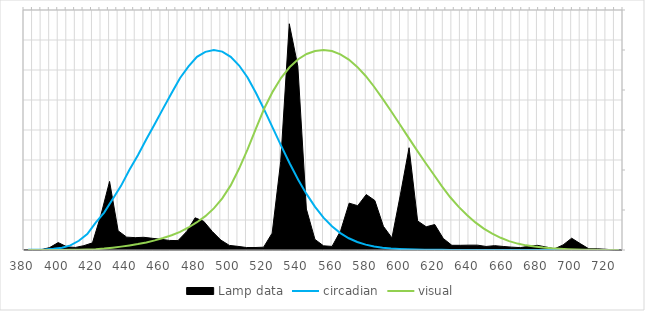
| Category | circadian | visual |
|---|---|---|
| 380.0 | 0.001 | 0 |
| 385.0 | 0.002 | 0 |
| 390.0 | 0.003 | 0 |
| 395.0 | 0.006 | 0 |
| 400.0 | 0.011 | 0 |
| 405.0 | 0.023 | 0.001 |
| 410.0 | 0.046 | 0.001 |
| 415.0 | 0.079 | 0.002 |
| 420.0 | 0.137 | 0.004 |
| 425.0 | 0.187 | 0.007 |
| 430.0 | 0.254 | 0.012 |
| 435.0 | 0.321 | 0.017 |
| 440.0 | 0.402 | 0.023 |
| 445.0 | 0.474 | 0.03 |
| 450.0 | 0.554 | 0.038 |
| 455.0 | 0.63 | 0.048 |
| 460.0 | 0.708 | 0.06 |
| 465.0 | 0.785 | 0.074 |
| 470.0 | 0.86 | 0.091 |
| 475.0 | 0.918 | 0.113 |
| 480.0 | 0.966 | 0.139 |
| 485.0 | 0.991 | 0.169 |
| 490.0 | 1 | 0.208 |
| 495.0 | 0.992 | 0.259 |
| 500.0 | 0.966 | 0.323 |
| 505.0 | 0.922 | 0.407 |
| 510.0 | 0.863 | 0.503 |
| 515.0 | 0.785 | 0.608 |
| 520.0 | 0.7 | 0.71 |
| 525.0 | 0.609 | 0.793 |
| 530.0 | 0.519 | 0.862 |
| 535.0 | 0.433 | 0.915 |
| 540.0 | 0.352 | 0.954 |
| 545.0 | 0.279 | 0.98 |
| 550.0 | 0.216 | 0.995 |
| 555.0 | 0.162 | 1 |
| 560.0 | 0.119 | 0.995 |
| 565.0 | 0.084 | 0.979 |
| 570.0 | 0.059 | 0.952 |
| 575.0 | 0.04 | 0.915 |
| 580.0 | 0.027 | 0.87 |
| 585.0 | 0.018 | 0.816 |
| 590.0 | 0.012 | 0.757 |
| 595.0 | 0.008 | 0.695 |
| 600.0 | 0.005 | 0.631 |
| 605.0 | 0.003 | 0.567 |
| 610.0 | 0.002 | 0.503 |
| 615.0 | 0.001 | 0.441 |
| 620.0 | 0.001 | 0.381 |
| 625.0 | 0.001 | 0.321 |
| 630.0 | 0 | 0.265 |
| 635.0 | 0 | 0.217 |
| 640.0 | 0 | 0.175 |
| 645.0 | 0 | 0.138 |
| 650.0 | 0 | 0.107 |
| 655.0 | 0 | 0.082 |
| 660.0 | 0 | 0.061 |
| 665.0 | 0 | 0.045 |
| 670.0 | 0 | 0.032 |
| 675.0 | 0 | 0.023 |
| 680.0 | 0 | 0.017 |
| 685.0 | 0 | 0.012 |
| 690.0 | 0 | 0.008 |
| 695.0 | 0 | 0.006 |
| 700.0 | 0 | 0.004 |
| 705.0 | 0 | 0.003 |
| 710.0 | 0 | 0.001 |
| 715.0 | 0 | 0.001 |
| 720.0 | 0 | 0 |
| 725.0 | 0 | 0 |
| 730.0 | 0 | 0 |